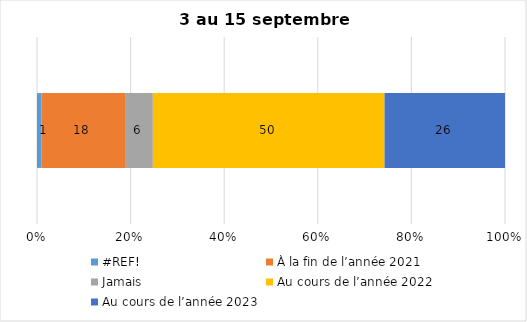
| Category | #REF! | À la fin de l’année 2021 | Jamais | Au cours de l’année 2022 | Au cours de l’année 2023 |
|---|---|---|---|---|---|
| 0 | 1 | 18 | 6 | 50 | 26 |